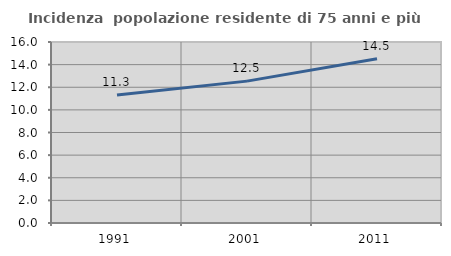
| Category | Incidenza  popolazione residente di 75 anni e più |
|---|---|
| 1991.0 | 11.325 |
| 2001.0 | 12.541 |
| 2011.0 | 14.514 |